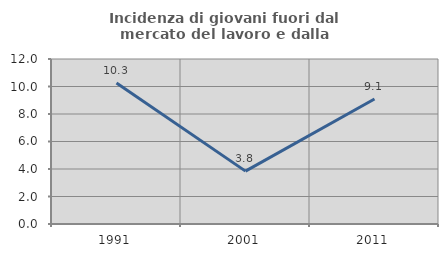
| Category | Incidenza di giovani fuori dal mercato del lavoro e dalla formazione  |
|---|---|
| 1991.0 | 10.256 |
| 2001.0 | 3.846 |
| 2011.0 | 9.091 |